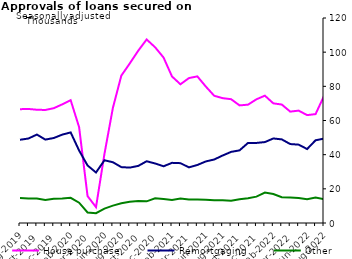
| Category | House purchase | Remortgaging | Other |
|---|---|---|---|
| Aug-2019 | 66628 | 48718 | 14598 |
| Sep-2019 | 66753 | 49460 | 14346 |
| Oct-2019 | 66297 | 51772 | 14397 |
| Nov-2019 | 66168 | 48825 | 13506 |
| Dec-2019 | 67203 | 49753 | 14237 |
| Jan-2020 | 69449 | 51727 | 14389 |
| Feb-2020 | 71881 | 53024 | 14722 |
| Mar-2020 | 56072 | 42429 | 11885 |
| Apr-2020 | 15760 | 33683 | 6167 |
| May-2020 | 9282 | 29564 | 5771 |
| Jun-2020 | 40414 | 36719 | 8454 |
| Jul-2020 | 67392 | 35573 | 10157 |
| Aug-2020 | 86281 | 32712 | 11529 |
| Sep-2020 | 93390 | 32416 | 12387 |
| Oct-2020 | 100860 | 33414 | 12866 |
| Nov-2020 | 107420 | 36146 | 12691 |
| Dec-2020 | 102863 | 34844 | 14489 |
| Jan-2021 | 96862 | 33196 | 14013 |
| Feb-2021 | 85771 | 35212 | 13495 |
| Mar-2021 | 81201 | 35027 | 14331 |
| Apr-2021 | 84818 | 32564 | 13820 |
| May-2021 | 85839 | 33960 | 13798 |
| Jun-2021 | 79895 | 36027 | 13672 |
| Jul-2021 | 74475 | 37176 | 13362 |
| Aug-2021 | 73075 | 39516 | 13254 |
| Sep-2021 | 72467 | 41636 | 13032 |
| Oct-2021 | 68839 | 42516 | 13907 |
| Nov-2021 | 69267 | 46865 | 14549 |
| Dec-2021 | 72410 | 46871 | 15436 |
| Jan-2022 | 74535 | 47372 | 17815 |
| Feb-2022 | 70035 | 49492 | 16944 |
| Mar-2022 | 69340 | 48941 | 15099 |
| Apr-2022 | 65202 | 46213 | 14988 |
| May-2022 | 65778 | 45871 | 14612 |
| Jun-2022 | 63155 | 43295 | 13937 |
| Jul-2022 | 63740 | 48417 | 14943 |
| Aug-2022 | 74340 | 49395 | 13920 |